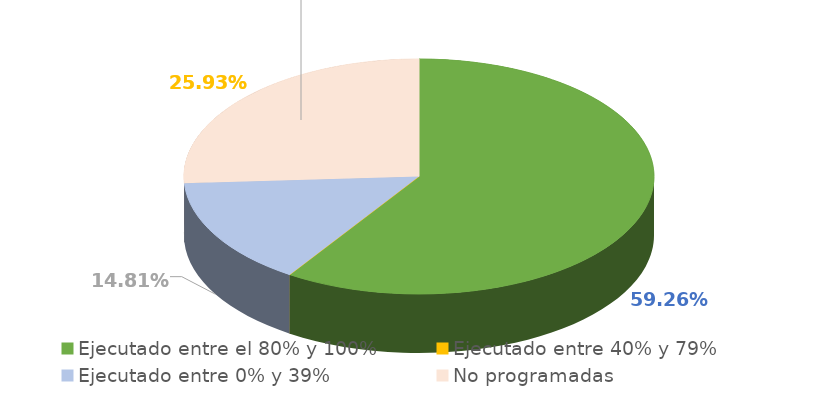
| Category | Series 0 |
|---|---|
| Ejecutado entre el 80% y 100% | 0.593 |
| Ejecutado entre 40% y 79% | 0 |
| Ejecutado entre 0% y 39% | 0.148 |
| No programadas | 0.259 |